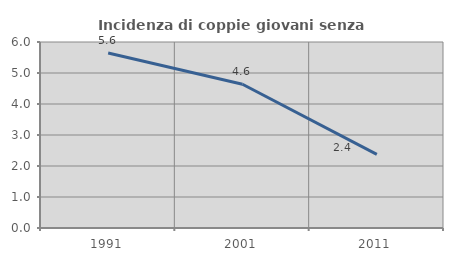
| Category | Incidenza di coppie giovani senza figli |
|---|---|
| 1991.0 | 5.647 |
| 2001.0 | 4.637 |
| 2011.0 | 2.373 |